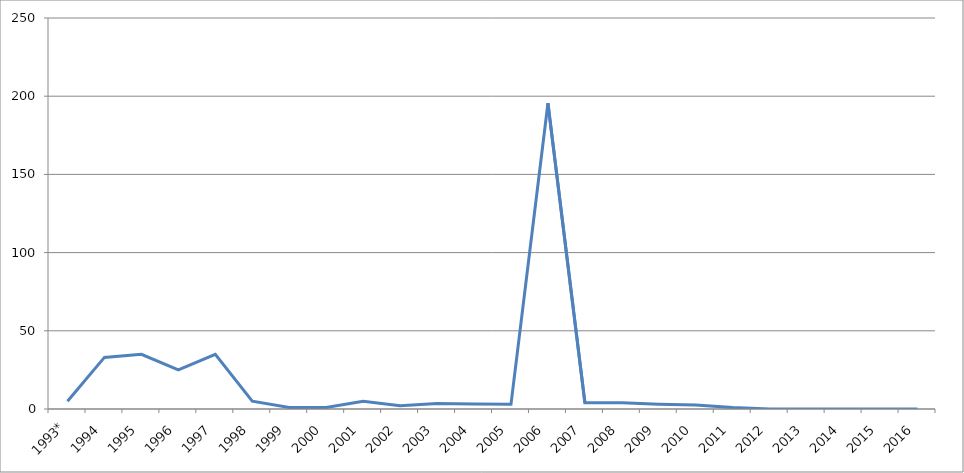
| Category | Series 0 |
|---|---|
| 1993* | 5 |
| 1994 | 33 |
| 1995 | 35 |
| 1996 | 25 |
| 1997 | 35 |
| 1998 | 5 |
| 1999 | 1 |
| 2000 | 1 |
| 2001 | 5 |
| 2002 | 2.1 |
| 2003 | 3.5 |
| 2004 | 3.25 |
| 2005 | 3 |
| 2006 | 195.5 |
| 2007 | 4 |
| 2008 | 4 |
| 2009 | 3 |
| 2010 | 2.5 |
| 2011 | 0.9 |
| 2012 | 0 |
| 2013 | 0 |
| 2014 | 0 |
| 2015 | 0 |
| 2016 | 0 |